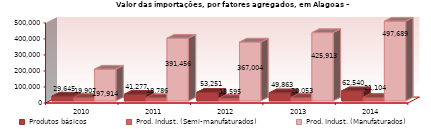
| Category | Produtos básicos | Prod. Indust. (Semi-manufaturados) | Prod. Indust. (Manufaturados) |
|---|---|---|---|
| 2010.0 | 29645 | 19907 | 197914 |
| 2011.0 | 41277 | 18786 | 391456 |
| 2012.0 | 53251 | 13595 | 367004 |
| 2013.0 | 49863 | 20053 | 425913 |
| 2014.0 | 62540 | 21104 | 497689 |